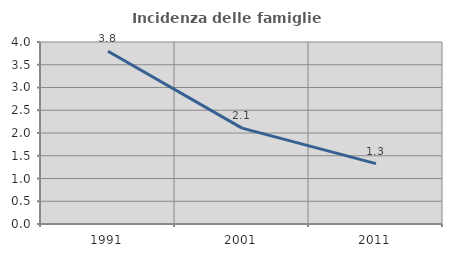
| Category | Incidenza delle famiglie numerose |
|---|---|
| 1991.0 | 3.797 |
| 2001.0 | 2.107 |
| 2011.0 | 1.327 |